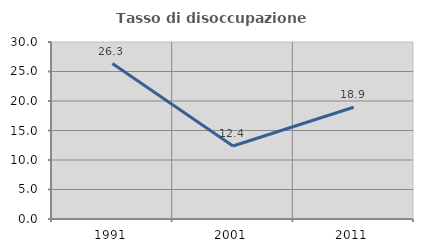
| Category | Tasso di disoccupazione giovanile  |
|---|---|
| 1991.0 | 26.338 |
| 2001.0 | 12.381 |
| 2011.0 | 18.932 |